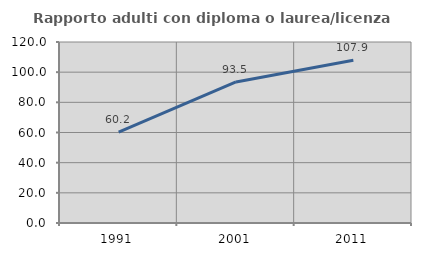
| Category | Rapporto adulti con diploma o laurea/licenza media  |
|---|---|
| 1991.0 | 60.248 |
| 2001.0 | 93.484 |
| 2011.0 | 107.921 |